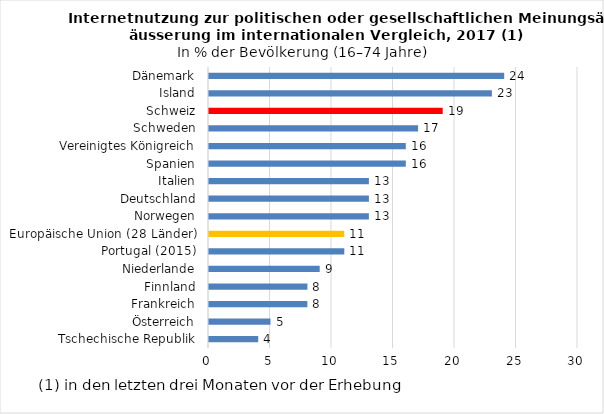
| Category | Series 0 |
|---|---|
| Tschechische Republik | 4 |
| Österreich | 5 |
| Frankreich | 8 |
| Finnland | 8 |
| Niederlande | 9 |
| Portugal (2015) | 11 |
| Europäische Union (28 Länder) | 11 |
| Norwegen | 13 |
| Deutschland | 13 |
| Italien | 13 |
| Spanien | 16 |
| Vereinigtes Königreich | 16 |
| Schweden | 17 |
| Schweiz | 19 |
| Island | 23 |
| Dänemark | 24 |